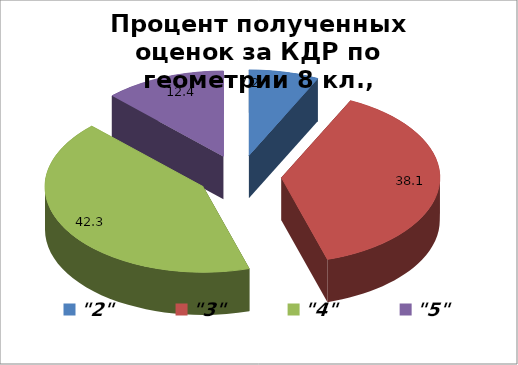
| Category | Series 0 |
|---|---|
| "2" | 7.16 |
| "3" | 38.146 |
| "4" | 42.254 |
| "5" | 12.441 |